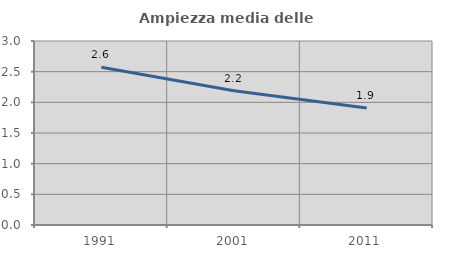
| Category | Ampiezza media delle famiglie |
|---|---|
| 1991.0 | 2.572 |
| 2001.0 | 2.188 |
| 2011.0 | 1.909 |